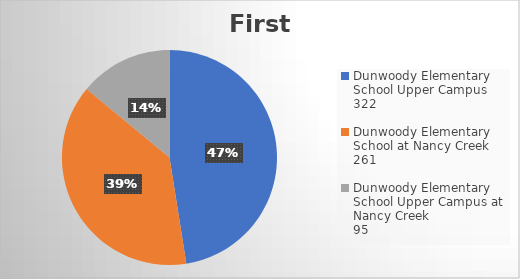
| Category | Series 0 |
|---|---|
| Dunwoody Elementary School Upper Campus
322 | 322 |
| Dunwoody Elementary School at Nancy Creek
261 | 261 |
| Dunwoody Elementary School Upper Campus at Nancy Creek
95 | 95 |